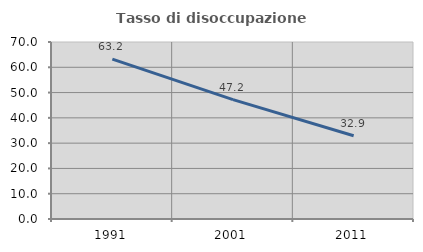
| Category | Tasso di disoccupazione giovanile  |
|---|---|
| 1991.0 | 63.218 |
| 2001.0 | 47.222 |
| 2011.0 | 32.941 |